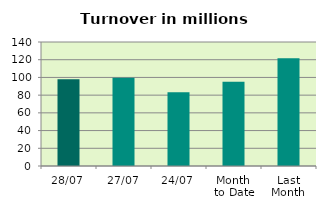
| Category | Series 0 |
|---|---|
| 28/07 | 97.9 |
| 27/07 | 99.739 |
| 24/07 | 83.278 |
| Month 
to Date | 94.997 |
| Last
Month | 121.74 |